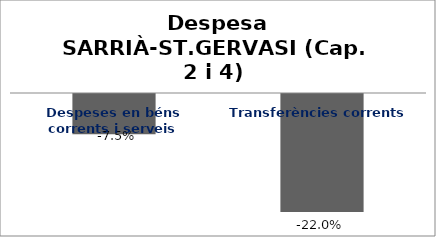
| Category | Series 0 |
|---|---|
| Despeses en béns corrents i serveis | -0.075 |
| Transferències corrents | -0.22 |